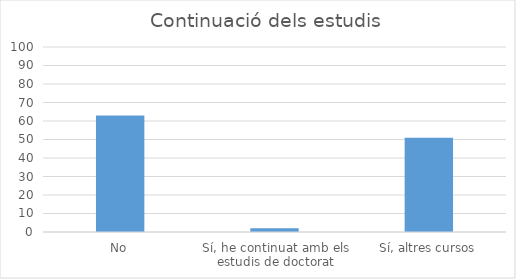
| Category | Series 0 |
|---|---|
| No | 63 |
| Sí, he continuat amb els estudis de doctorat | 2 |
| Sí, altres cursos | 51 |